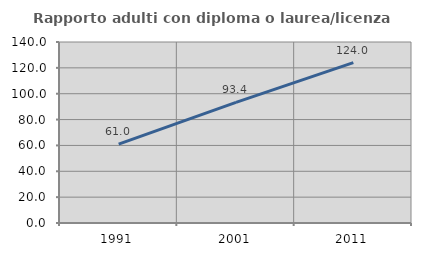
| Category | Rapporto adulti con diploma o laurea/licenza media  |
|---|---|
| 1991.0 | 60.958 |
| 2001.0 | 93.355 |
| 2011.0 | 124.012 |